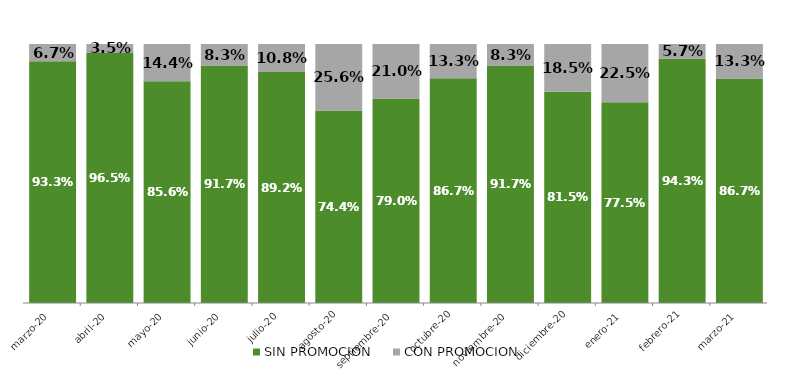
| Category | SIN PROMOCION   | CON PROMOCION   |
|---|---|---|
| 2020-03-01 | 0.933 | 0.067 |
| 2020-04-01 | 0.965 | 0.035 |
| 2020-05-01 | 0.856 | 0.144 |
| 2020-06-01 | 0.917 | 0.083 |
| 2020-07-01 | 0.892 | 0.108 |
| 2020-08-01 | 0.744 | 0.256 |
| 2020-09-01 | 0.79 | 0.21 |
| 2020-10-01 | 0.867 | 0.133 |
| 2020-11-01 | 0.917 | 0.083 |
| 2020-12-01 | 0.815 | 0.185 |
| 2021-01-01 | 0.775 | 0.225 |
| 2021-02-01 | 0.943 | 0.057 |
| 2021-03-01 | 0.867 | 0.133 |